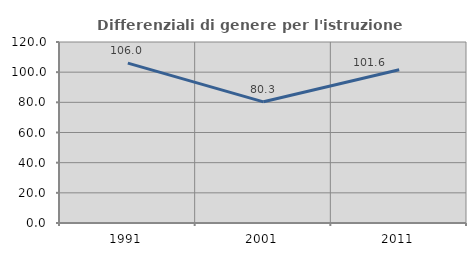
| Category | Differenziali di genere per l'istruzione superiore |
|---|---|
| 1991.0 | 106.008 |
| 2001.0 | 80.342 |
| 2011.0 | 101.63 |